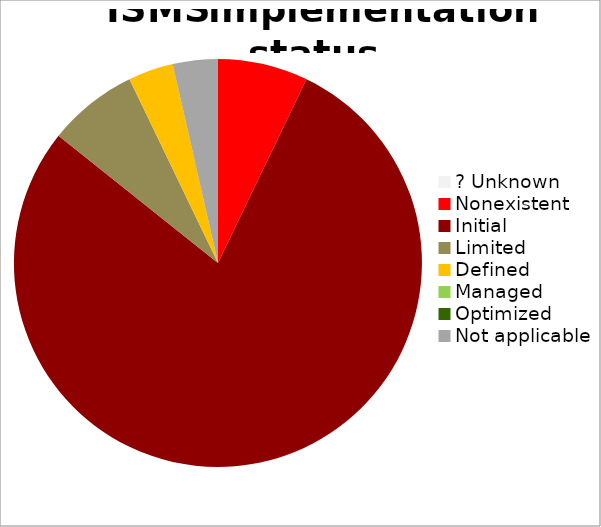
| Category | Series 0 |
|---|---|
| ? Unknown | 0 |
| Nonexistent | 0.071 |
| Initial | 0.786 |
| Limited | 0.071 |
| Defined | 0.036 |
| Managed | 0 |
| Optimized | 0 |
| Not applicable | 0.036 |